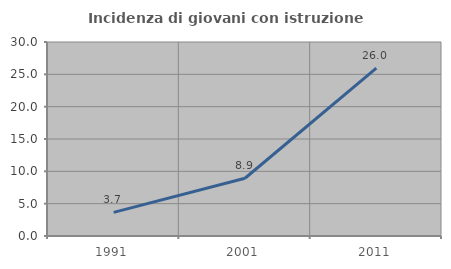
| Category | Incidenza di giovani con istruzione universitaria |
|---|---|
| 1991.0 | 3.659 |
| 2001.0 | 8.929 |
| 2011.0 | 25.974 |